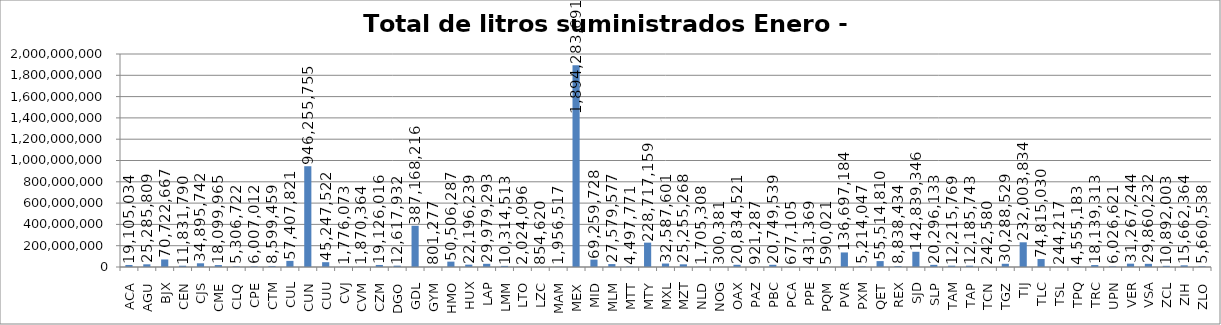
| Category | Total de litros suministrados Enero - Diciembre |
|---|---|
| ACA | 19105034 |
| AGU | 25285809 |
| BJX | 70722667 |
| CEN | 11831790 |
| CJS | 34895742 |
| CME | 18099965 |
| CLQ | 5306722 |
| CPE | 6007012 |
| CTM | 8599459 |
| CUL | 57407821 |
| CUN | 946255755 |
| CUU | 45247522 |
| CVJ | 1776073 |
| CVM | 1870364 |
| CZM | 19126016 |
| DGO | 12617932 |
| GDL | 387168216 |
| GYM | 801277 |
| HMO | 50506287 |
| HUX | 22196239 |
| LAP | 29979293 |
| LMM | 10314513 |
| LTO | 2024096 |
| LZC | 854620 |
| MAM | 1956517 |
| MEX | 1894283691 |
| MID | 69259728 |
| MLM | 27579577 |
| MTT | 4497771 |
| MTY | 228717159 |
| MXL | 32587601 |
| MZT | 25255268 |
| NLD | 1705308 |
| NOG | 300381 |
| OAX | 20834521 |
| PAZ | 921287 |
| PBC | 20749539 |
| PCA | 677105 |
| PPE | 431369 |
| PQM | 590021 |
| PVR | 136697184 |
| PXM | 5214047 |
| QET | 55514810 |
| REX | 8838434 |
| SJD | 142839346 |
| SLP | 20296133 |
| TAM | 12215769 |
| TAP | 12185743 |
| TCN | 242580 |
| TGZ | 30288529 |
| TIJ | 232003834 |
| TLC | 74815030 |
| TSL | 244217 |
| TPQ | 4555183 |
| TRC | 18139313 |
| UPN | 6026621 |
| VER | 31267244 |
| VSA | 29860232 |
| ZCL | 10892003 |
| ZIH | 15662364 |
| ZLO | 5660538 |